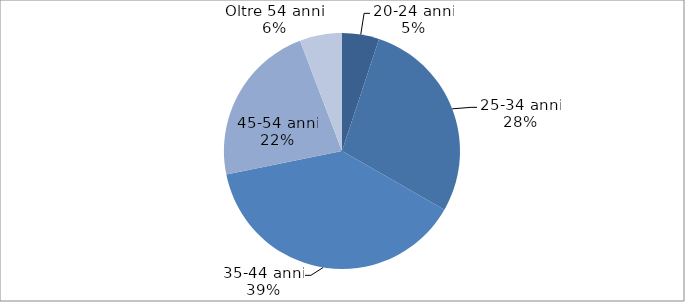
| Category | Series 0 |
|---|---|
| 20-24 anni | 0.051 |
| 25-34 anni | 0.282 |
| 35-44 anni | 0.385 |
| 45-54 anni | 0.224 |
| Oltre 54 anni | 0.058 |